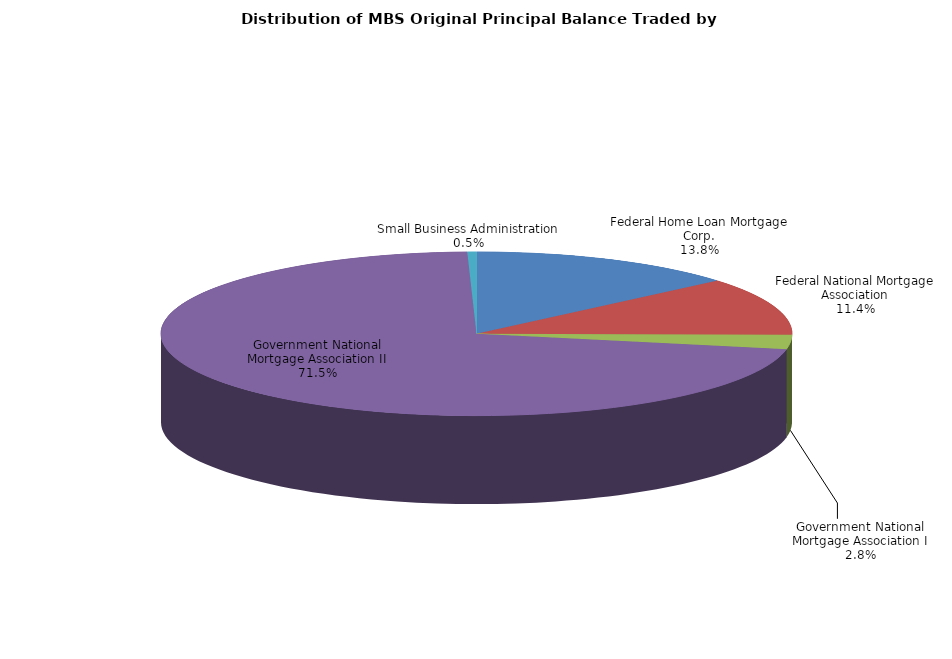
| Category | Series 0 |
|---|---|
| Federal Home Loan Mortgage Corp. | 1564553664.36 |
| Federal National Mortgage Association | 1297390287.925 |
| Government National Mortgage Association I | 320647426.475 |
| Government National Mortgage Association II | 8128952088.461 |
| Small Business Administration | 53144374.76 |